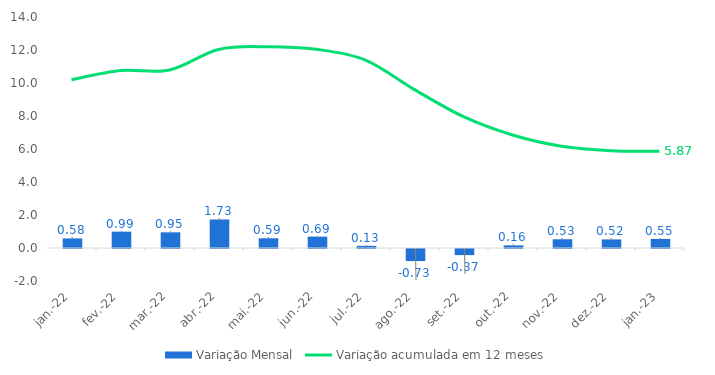
| Category | Variação Mensal |
|---|---|
| 2022-01-01 | 0.58 |
| 2022-02-01 | 0.99 |
| 2022-03-01 | 0.95 |
| 2022-04-01 | 1.73 |
| 2022-05-01 | 0.59 |
| 2022-06-01 | 0.69 |
| 2022-07-01 | 0.13 |
| 2022-08-01 | -0.73 |
| 2022-09-01 | -0.37 |
| 2022-10-01 | 0.16 |
| 2022-11-01 | 0.53 |
| 2022-12-01 | 0.52 |
| 2023-01-01 | 0.55 |